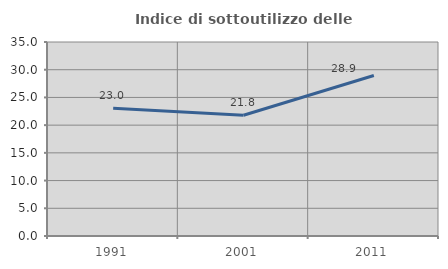
| Category | Indice di sottoutilizzo delle abitazioni  |
|---|---|
| 1991.0 | 23.044 |
| 2001.0 | 21.78 |
| 2011.0 | 28.946 |